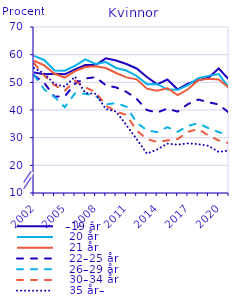
| Category |   –19 år |    20 år |    21 år |    22–25 år |    26–29 år |    30–34 år |    35 år– |
|---|---|---|---|---|---|---|---|
| 2002.0 | 53.576 | 59.539 | 57.791 | 52.48 | 52.573 | 56.914 | 55.185 |
| 2003.0 | 52.965 | 58.084 | 56.138 | 49.803 | 47.461 | 52.47 | 53.206 |
| 2004.0 | 53.113 | 54.308 | 53.093 | 44.811 | 44.682 | 48.989 | 49.333 |
| 2005.0 | 52.896 | 54.231 | 51.738 | 44.924 | 41.029 | 46.986 | 48.504 |
| 2006.0 | 54.66 | 55.993 | 54.063 | 49.559 | 46.079 | 50.564 | 52.049 |
| 2007.0 | 56.231 | 58.282 | 55.522 | 51.379 | 45.85 | 48.188 | 46.142 |
| 2008.0 | 56.263 | 56.659 | 55.802 | 51.877 | 45.196 | 46.493 | 45.845 |
| 2009.0 | 58.671 | 57.335 | 55.155 | 48.933 | 42.018 | 41.6 | 40.362 |
| 2010.0 | 57.882 | 55.202 | 53.368 | 48.152 | 42.522 | 39.405 | 39.409 |
| 2011.0 | 56.62 | 54.272 | 51.792 | 46.569 | 41.209 | 38.258 | 34.546 |
| 2012.0 | 55.007 | 52.298 | 51.067 | 44.022 | 35.493 | 32.578 | 29.47 |
| 2013.0 | 51.925 | 49.345 | 47.703 | 39.974 | 32.637 | 29.498 | 24.237 |
| 2014.0 | 49.276 | 49.427 | 46.948 | 39.078 | 32.018 | 28.445 | 25.701 |
| 2015.0 | 51.033 | 47.406 | 47.876 | 40.525 | 33.788 | 29.021 | 27.832 |
| 2016.0 | 47.446 | 47.304 | 45.408 | 39.407 | 32.144 | 29.503 | 27.475 |
| 2017.0 | 49.492 | 49.001 | 47.482 | 42.147 | 34.218 | 32.134 | 27.946 |
| 2018.0 | 50.768 | 51.478 | 50.795 | 43.779 | 35.271 | 33.11 | 27.662 |
| 2019.0 | 51.628 | 52.332 | 51.32 | 42.798 | 33.396 | 30.796 | 27.034 |
| 2020.0 | 55 | 53 | 51 | 42 | 32 | 29 | 24.836 |
| 2021.0 | 51 | 48 | 48 | 39 | 31 | 28 | 25.372 |